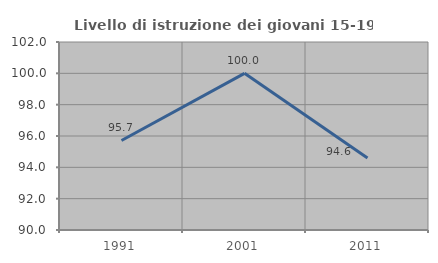
| Category | Livello di istruzione dei giovani 15-19 anni |
|---|---|
| 1991.0 | 95.714 |
| 2001.0 | 100 |
| 2011.0 | 94.595 |